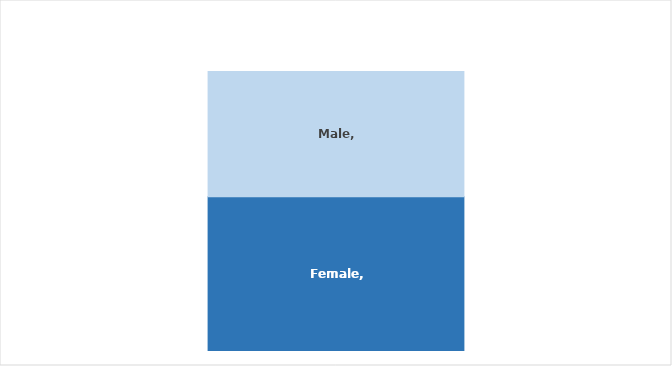
| Category | Female | Male |
|---|---|---|
| East Ayrshire | 0.553 | 0.447 |